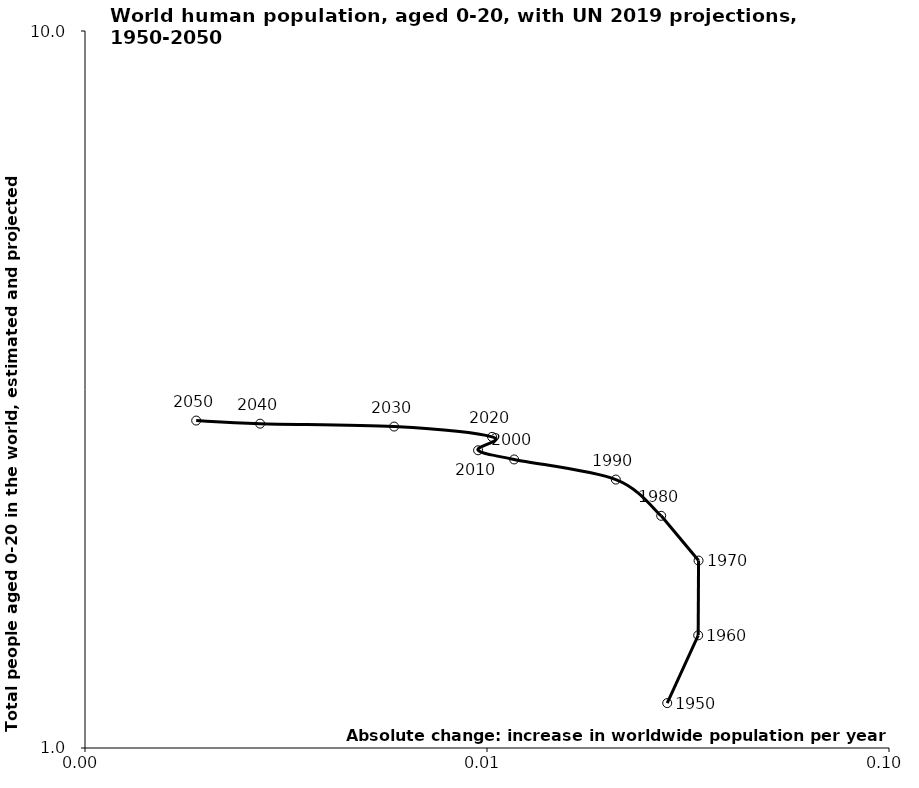
| Category | Series 0 |
|---|---|
| 0.028072569899999955 | 1.155 |
| 0.03352156539999999 | 1.436 |
| 0.03359233375 | 1.826 |
| 0.02712174475000002 | 2.108 |
| 0.02091657455 | 2.368 |
| 0.011682033750000032 | 2.526 |
| 0.009501973200000013 | 2.602 |
| 0.01029455929999996 | 2.716 |
| 0.005873644899999997 | 2.808 |
| 0.002726157149999975 | 2.834 |
| 0.0018905408000000179 | 2.862 |